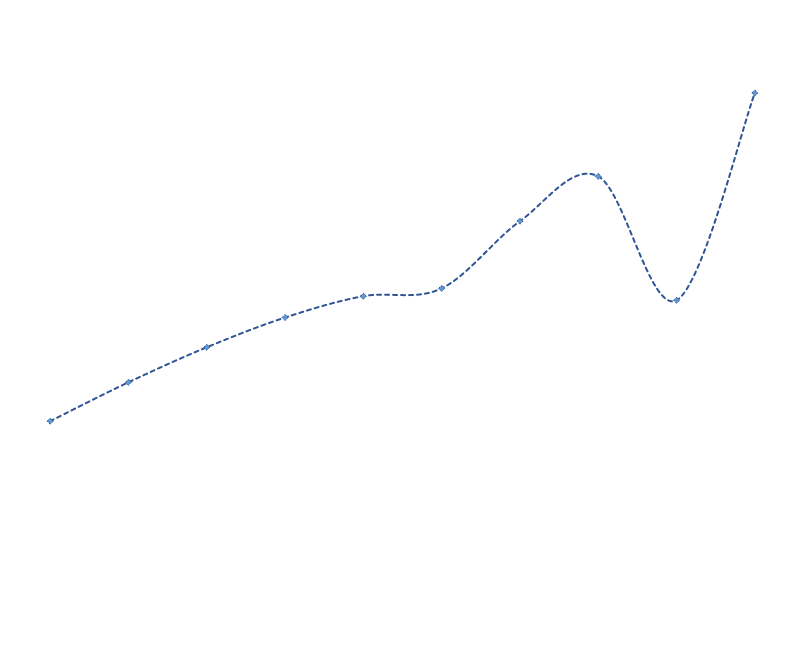
| Category | Series 0 |
|---|---|
| 0 | 18464.674 |
| 1 | 18896.75 |
| 2 | 19285.687 |
| 3 | 19616.267 |
| 4 | 19853.778 |
| 5 | 19940.456 |
| 6 | 20687.002 |
| 7 | 21184.747 |
| 8 | 19807.803 |
| 9 | 22111.842 |